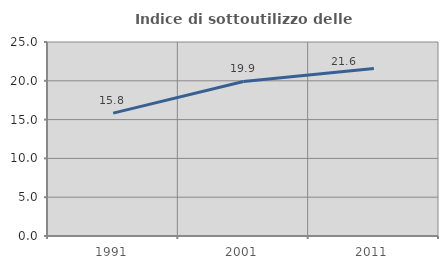
| Category | Indice di sottoutilizzo delle abitazioni  |
|---|---|
| 1991.0 | 15.83 |
| 2001.0 | 19.91 |
| 2011.0 | 21.583 |